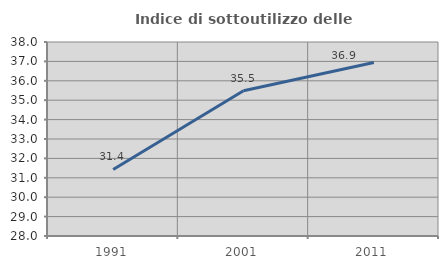
| Category | Indice di sottoutilizzo delle abitazioni  |
|---|---|
| 1991.0 | 31.429 |
| 2001.0 | 35.484 |
| 2011.0 | 36.943 |